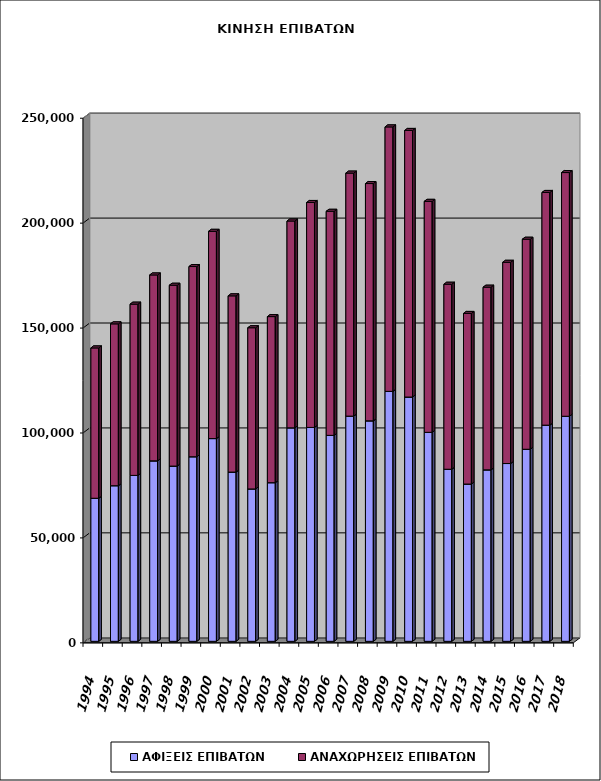
| Category | ΑΦΙΞΕΙΣ ΕΠΙΒΑΤΩΝ | ΑΝΑΧΩΡΗΣΕΙΣ ΕΠΙΒΑΤΩΝ |
|---|---|---|
| 1994.0 | 68174 | 71642 |
| 1995.0 | 74161 | 77121 |
| 1996.0 | 79067 | 81600 |
| 1997.0 | 85999 | 88588 |
| 1998.0 | 83515 | 86175 |
| 1999.0 | 87957 | 90641 |
| 2000.0 | 96621 | 98758 |
| 2001.0 | 80652 | 83978 |
| 2002.0 | 72622 | 76814 |
| 2003.0 | 75599 | 79144 |
| 2004.0 | 101736 | 98558 |
| 2005.0 | 101931 | 107193 |
| 2006.0 | 98157 | 106768 |
| 2007.0 | 107313 | 115813 |
| 2008.0 | 105068 | 113086 |
| 2009.0 | 119117 | 126018 |
| 2010.0 | 116422 | 127031 |
| 2011.0 | 99593 | 110068 |
| 2012.0 | 82004 | 88157 |
| 2013.0 | 74951 | 81295 |
| 2014.0 | 81704 | 87054 |
| 2015.0 | 84725 | 95893 |
| 2016.0 | 91528 | 100083 |
| 2017.0 | 103015 | 110888 |
| 2018.0 | 107249 | 116141 |